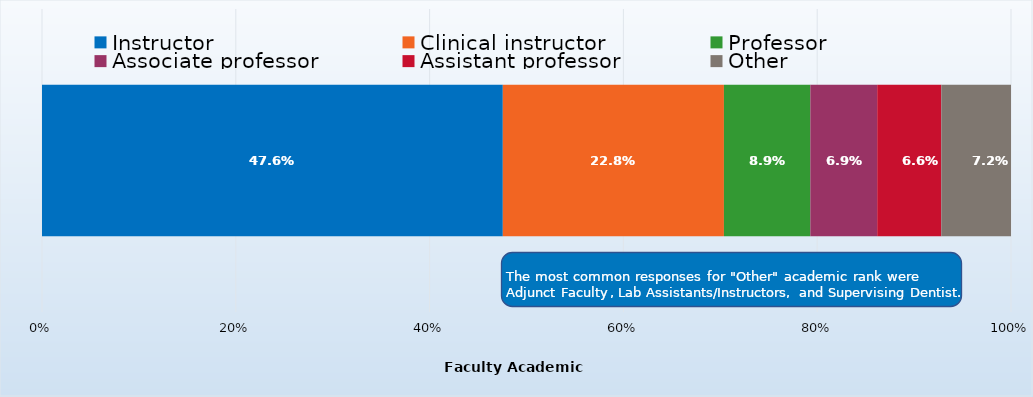
| Category | Instructor | Clinical instructor | Professor | Associate professor | Assistant professor | Other |
|---|---|---|---|---|---|---|
| 0 | 0.476 | 0.228 | 0.089 | 0.069 | 0.066 | 0.072 |